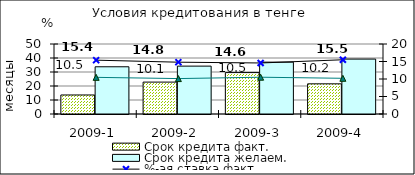
| Category | Срок кредита факт.  | Срок кредита желаем. |
|---|---|---|
| 2009-1 | 13.59 | 33.73 |
| 2009-2 | 22.78 | 34.2 |
| 2009-3 | 29.58 | 37.04 |
| 2009-4 | 21.55 | 39.22 |